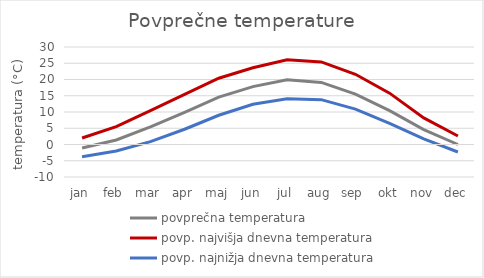
| Category | povprečna temperatura | povp. najvišja dnevna temperatura | povp. najnižja dnevna temperatura |
|---|---|---|---|
| jan | -1.1 | 2 | -3.8 |
| feb | 1.4 | 5.5 | -2 |
| mar | 5.4 | 10.4 | 0.9 |
| apr | 9.9 | 15.4 | 4.7 |
| maj | 14.6 | 20.4 | 9 |
| jun | 17.8 | 23.6 | 12.4 |
| jul | 19.9 | 26.1 | 14.1 |
| aug | 19.1 | 25.4 | 13.8 |
| sep | 15.5 | 21.6 | 10.9 |
| okt | 10.4 | 15.8 | 6.5 |
| nov | 4.6 | 8.2 | 1.7 |
| dec | 0 | 2.6 | -2.3 |